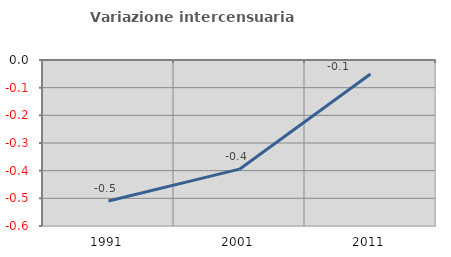
| Category | Variazione intercensuaria annua |
|---|---|
| 1991.0 | -0.509 |
| 2001.0 | -0.395 |
| 2011.0 | -0.05 |